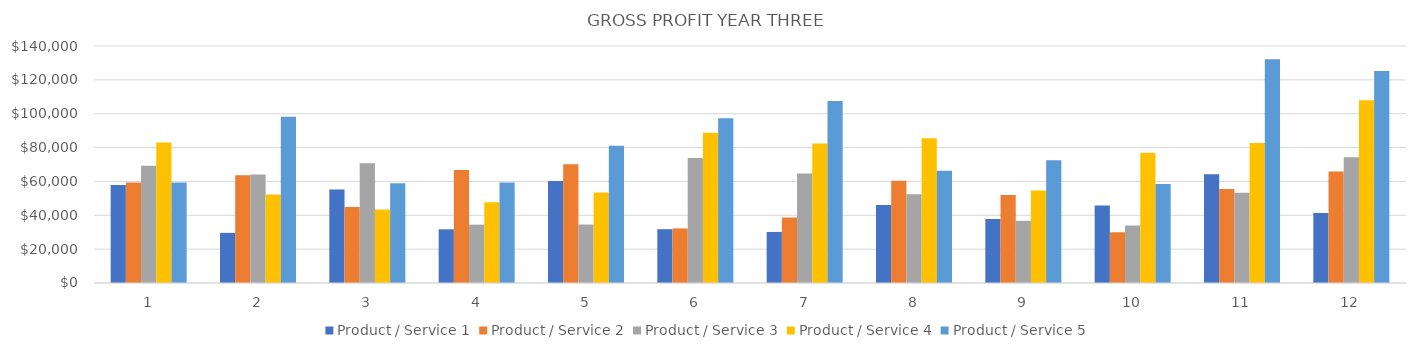
| Category | Product / Service 1 | Product / Service 2 | Product / Service 3 | Product / Service 4 | Product / Service 5 |
|---|---|---|---|---|---|
| 0 | 57836.6 | 59440 | 69246 | 82984 | 59413.5 |
| 1 | 29614.1 | 63648 | 64143 | 52347.6 | 98185.5 |
| 2 | 55166.4 | 44895 | 70812 | 43367.7 | 58932.5 |
| 3 | 31708.8 | 66690.6 | 34479 | 47752.2 | 59427.5 |
| 4 | 60206.4 | 70077.2 | 34560 | 53457.6 | 81075 |
| 5 | 31779.6 | 32250.6 | 73809 | 88777.8 | 97290 |
| 6 | 30153.7 | 38663 | 64629 | 82350.9 | 107459.5 |
| 7 | 46071.9 | 60368.4 | 52452 | 85547.7 | 66308.5 |
| 8 | 37793.3 | 52053.6 | 36738 | 54600.9 | 72485.5 |
| 9 | 45727.2 | 29979.2 | 33957 | 76889.7 | 58522 |
| 10 | 64291.5 | 55457.4 | 53364 | 82752.7 | 132151.5 |
| 11 | 41314 | 65830.8 | 74340 | 108009.5 | 125209.5 |